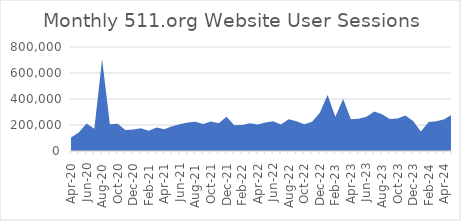
| Category | Website User Sessions |
|---|---|
| 2020-04-01 | 104180 |
| 2020-05-01 | 141814 |
| 2020-06-01 | 212059 |
| 2020-07-01 | 171297 |
| 2020-08-01 | 705936 |
| 2020-09-01 | 205406 |
| 2020-10-01 | 210104 |
| 2020-11-01 | 161304 |
| 2020-12-01 | 164858 |
| 2021-01-01 | 174802 |
| 2021-02-01 | 156663 |
| 2021-03-01 | 181413 |
| 2021-04-01 | 167894 |
| 2021-05-01 | 190086 |
| 2021-06-01 | 205533 |
| 2021-07-01 | 219755 |
| 2021-08-01 | 225923 |
| 2021-09-01 | 208188 |
| 2021-10-01 | 227173 |
| 2021-11-01 | 212693 |
| 2021-12-01 | 264094 |
| 2022-01-01 | 198949 |
| 2022-02-01 | 199247 |
| 2022-03-01 | 213263 |
| 2022-04-01 | 203498 |
| 2022-05-01 | 218356 |
| 2022-06-01 | 228392 |
| 2022-07-01 | 203750 |
| 2022-08-01 | 244062 |
| 2022-09-01 | 228147 |
| 2022-10-01 | 206318 |
| 2022-11-01 | 225551 |
| 2022-12-01 | 293799 |
| 2023-01-01 | 431573 |
| 2023-02-01 | 264326 |
| 2023-03-01 | 400336 |
| 2023-04-01 | 243471 |
| 2023-05-01 | 248203 |
| 2023-06-01 | 263653 |
| 2023-07-01 | 304038 |
| 2023-08-01 | 282506 |
| 2023-09-01 | 245657 |
| 2023-10-01 | 250899 |
| 2023-11-01 | 272225 |
| 2023-12-01 | 231432 |
| 2024-01-01 | 150555 |
| 2024-02-01 | 222528 |
| 2024-03-01 | 228786 |
| 2024-04-01 | 243785 |
| 2024-05-01 | 280547 |